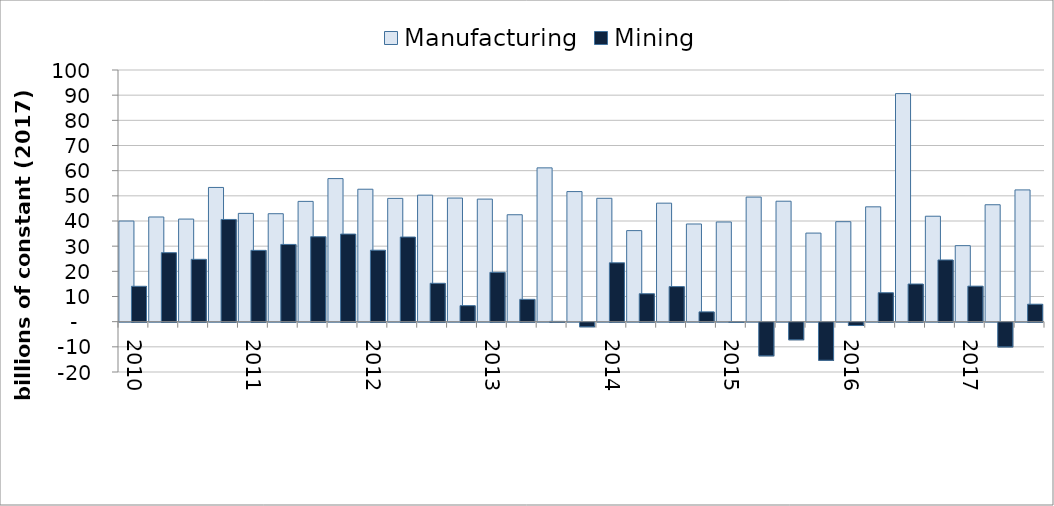
| Category |  Manufacturing  |  Mining  |
|---|---|---|
| 2010.0 | 39.983 | 14.06 |
| nan | 41.589 | 27.411 |
| nan | 40.765 | 24.775 |
| nan | 53.332 | 40.611 |
| 2011.0 | 43.03 | 28.339 |
| nan | 42.897 | 30.689 |
| nan | 47.793 | 33.748 |
| nan | 56.855 | 34.803 |
| 2012.0 | 52.625 | 28.397 |
| nan | 48.986 | 33.628 |
| nan | 50.27 | 15.249 |
| nan | 49.119 | 6.364 |
| 2013.0 | 48.7 | 19.601 |
| nan | 42.485 | 8.868 |
| nan | 61.112 | 0.121 |
| nan | 51.688 | -1.827 |
| 2014.0 | 49.025 | 23.389 |
| nan | 36.176 | 11.098 |
| nan | 47.087 | 13.935 |
| nan | 38.813 | 3.89 |
| 2015.0 | 39.613 | -0.117 |
| nan | 49.499 | -13.367 |
| nan | 47.865 | -6.982 |
| nan | 35.2 | -15.139 |
| 2016.0 | 39.731 | -1.331 |
| nan | 45.631 | 11.495 |
| nan | 90.613 | 14.958 |
| nan | 41.898 | 24.517 |
| 2017.0 | 30.204 | 14.11 |
| nan | 46.462 | -9.822 |
| nan | 52.352 | 6.933 |